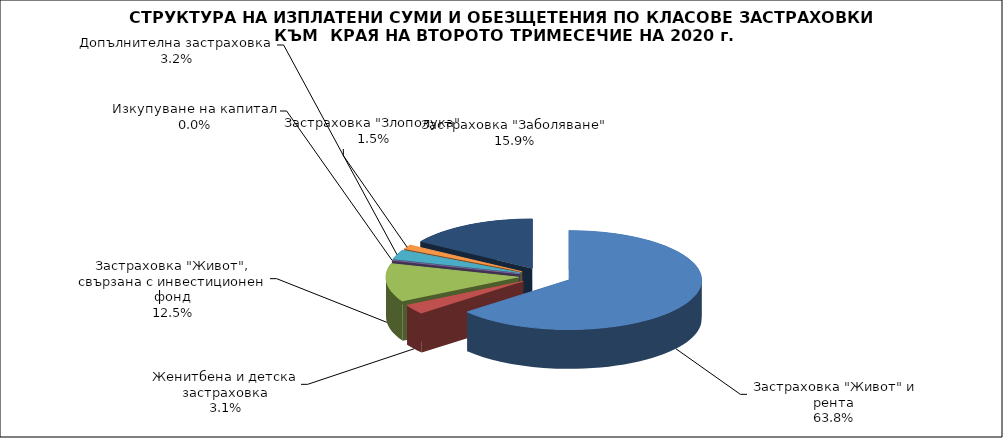
| Category | Series 0 |
|---|---|
|  Застраховка "Живот" и рента | 56180823.432 |
| Женитбена и детска застраховка | 2711141.824 |
| Застраховка "Живот", свързана с инвестиционен фонд | 11001850.233 |
| Изкупуване на капитал | 0 |
| Допълнителна застраховка | 2773035.581 |
| Застраховка "Злополука" | 1298836.149 |
| Застраховка "Заболяване" | 14023147.046 |